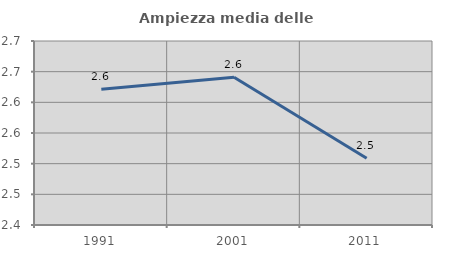
| Category | Ampiezza media delle famiglie |
|---|---|
| 1991.0 | 2.621 |
| 2001.0 | 2.641 |
| 2011.0 | 2.509 |